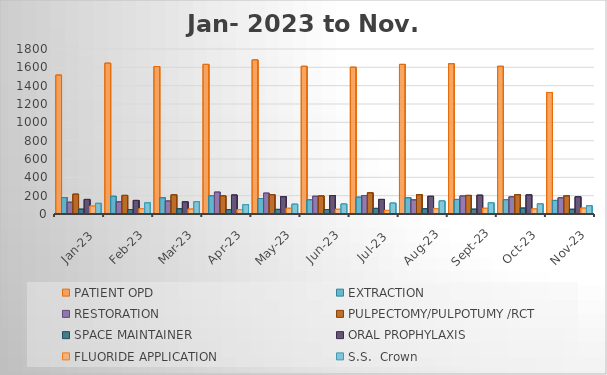
| Category | PATIENT OPD | EXTRACTION | RESTORATION | PULPECTOMY/PULPOTUMY /RCT | SPACE MAINTAINER | ORAL PROPHYLAXIS | FLUORIDE APPLICATION | S.S.  Crown  |
|---|---|---|---|---|---|---|---|---|
| 2023-01-01 | 1515 | 179 | 128 | 216 | 52 | 159 | 86 | 116 |
| 2023-02-01 | 1645 | 193 | 133 | 203 | 49 | 148 | 58 | 122 |
| 2023-03-01 | 1609 | 177 | 141 | 209 | 57 | 133 | 53 | 134 |
| 2023-04-01 | 1632 | 198 | 238 | 198 | 48 | 207 | 48 | 102 |
| 2023-05-01 | 1681 | 169 | 227 | 211 | 50 | 189 | 62 | 107 |
| 2023-06-01 | 1611 | 155 | 193 | 197 | 49 | 201 | 51 | 109 |
| 2023-07-01 | 1601 | 183 | 201 | 231 | 61 | 159 | 39 | 119 |
| 2023-08-01 | 1632 | 177 | 154 | 211 | 58 | 193 | 58 | 143 |
| 2023-09-01 | 1639 | 159 | 196 | 203 | 52 | 205 | 62 | 122 |
| 2023-10-01 | 1611 | 156 | 188 | 211 | 64 | 209 | 55 | 111 |
| 2023-11-01 | 1325 | 148 | 177 | 198 | 51 | 188 | 64 | 90 |